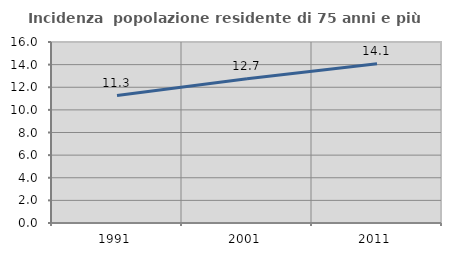
| Category | Incidenza  popolazione residente di 75 anni e più |
|---|---|
| 1991.0 | 11.267 |
| 2001.0 | 12.748 |
| 2011.0 | 14.078 |